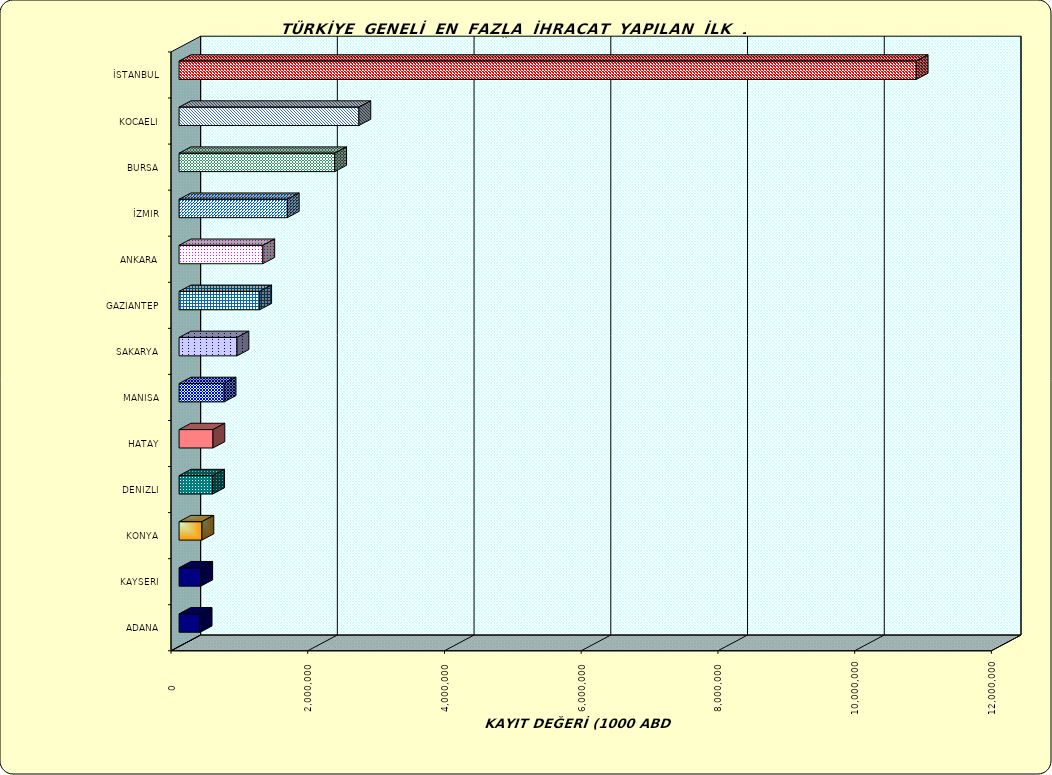
| Category | Series 0 |
|---|---|
| İSTANBUL | 10782598.906 |
| KOCAELI | 2630433.591 |
| BURSA | 2276403.215 |
| İZMIR | 1582956.802 |
| ANKARA | 1225155.205 |
| GAZIANTEP | 1179802.667 |
| SAKARYA | 847522.923 |
| MANISA | 659229.86 |
| HATAY | 495660.049 |
| DENIZLI | 491745.123 |
| KONYA | 334522.063 |
| KAYSERI | 317494.788 |
| ADANA | 308565.864 |